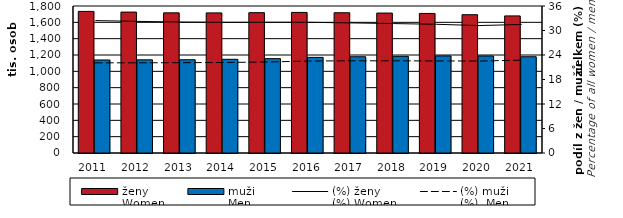
| Category | ženy  
Women | muži  
Men |
|---|---|---|
| 2011.0 | 1733924 | 1139080 |
| 2012.0 | 1725329 | 1140727 |
| 2013.0 | 1715906 | 1141950 |
| 2014.0 | 1715731 | 1147479 |
| 2015.0 | 1718422 | 1155531 |
| 2016.0 | 1721438 | 1171031 |
| 2017.0 | 1717160 | 1178803 |
| 2018.0 | 1713384 | 1183589 |
| 2019.0 | 1708994 | 1188533 |
| 2020.0 | 1693444 | 1187980 |
| 2021.0 | 1678752 | 1178892 |